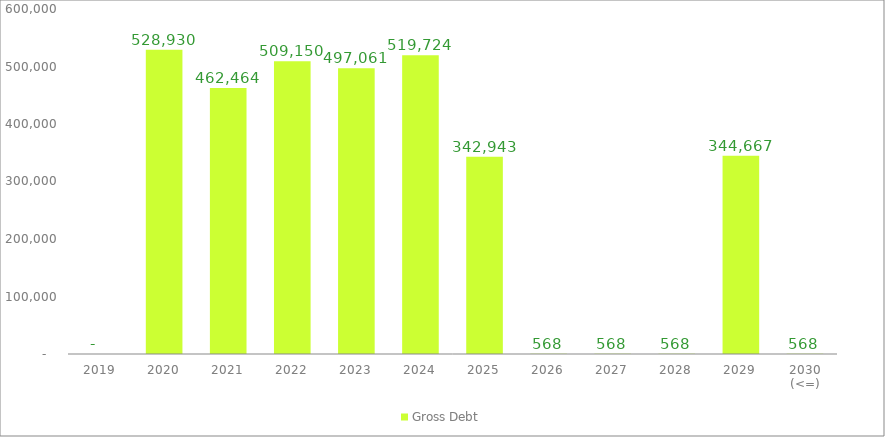
| Category | Gross Debt |
|---|---|
| 2019 | 0 |
| 2020 | 528930.169 |
| 2021 | 462463.946 |
| 2022 | 509150.223 |
| 2023 | 497060.766 |
| 2024 | 519723.938 |
| 2025 | 342943.053 |
| 2026 | 567.533 |
| 2027 | 567.533 |
| 2028 | 567.533 |
| 2029 | 344667.233 |
| 2030 (<=) | 567.533 |